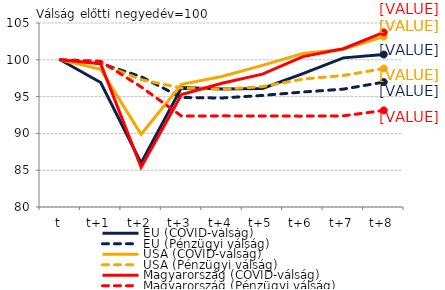
| Category | EU (COVID-válság) | EU (Pénzügyi válság) | USA (COVID-válság) | USA (Pénzügyi válság) | Magyarország (COVID-válság) | Magyarország (Pénzügyi válság) |
|---|---|---|---|---|---|---|
| t | 100 | 100 | 100 | 100 | 100 | 100 |
| t+1 | 96.909 | 99.494 | 98.696 | 99.473 | 99.479 | 99.806 |
| t+2 | 85.989 | 97.704 | 89.875 | 97.301 | 85.402 | 96.317 |
| t+3 | 96.231 | 94.874 | 96.659 | 96.167 | 95.283 | 92.354 |
| t+4 | 96.035 | 94.809 | 97.737 | 96.004 | 96.809 | 92.382 |
| t+5 | 96.098 | 95.16 | 99.236 | 96.351 | 98.049 | 92.371 |
| t+6 | 98.125 | 95.625 | 100.864 | 97.381 | 100.434 | 92.344 |
| t+7 | 100.262 | 96.014 | 101.441 | 97.868 | 101.508 | 92.385 |
| t+8 | 100.716 | 96.97 | 103.145 | 98.814 | 103.73 | 93.121 |